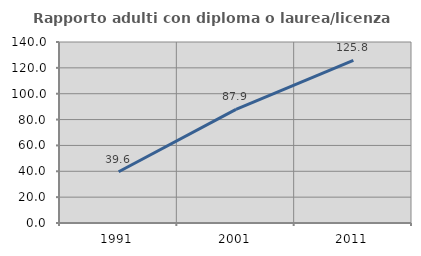
| Category | Rapporto adulti con diploma o laurea/licenza media  |
|---|---|
| 1991.0 | 39.619 |
| 2001.0 | 87.913 |
| 2011.0 | 125.817 |